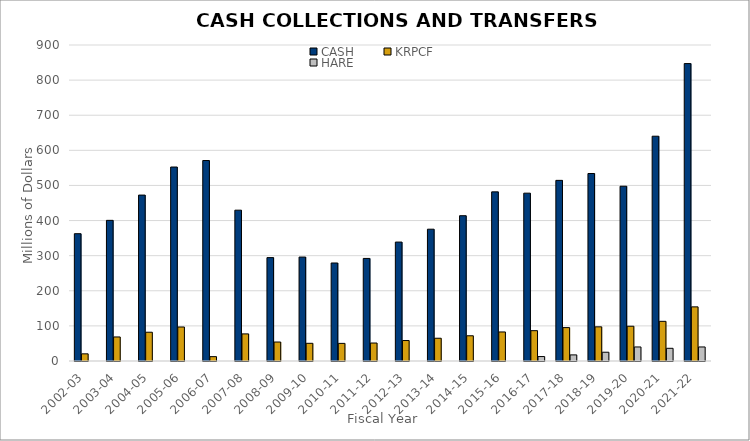
| Category | CASH | KRPCF | HARE |
|---|---|---|---|
| 2002-03 | 362.561 | 20.4 | 0 |
| 2003-04 | 400.59 | 68.456 | 0 |
| 2004-05 | 472.539 | 81.928 | 0 |
| 2005-06 | 552.45 | 96.879 | 0 |
| 2006-07 | 570.994 | 12.414 | 0 |
| 2007-08 | 429.54 | 77.2 | 0 |
| 2008-09 | 294.464 | 54.029 | 0 |
| 2009-10 | 296.033 | 50.392 | 0 |
| 2010-11 | 279.151 | 50.167 | 0 |
| 2011-12 | 292.152 | 51.203 | 0 |
| 2012-13 | 338.745 | 58.317 | 0 |
| 2013-14 | 375.408 | 64.806 | 0 |
| 2014-15 | 413.779 | 71.841 | 0 |
| 2015-16 | 481.72 | 82.717 | 0 |
| 2016-17 | 478.005 | 86.406 | 12.668 |
| 2017-18 | 514.441 | 95.101 | 17.395 |
| 2018-19 | 533.981 | 97.289 | 25 |
| 2019-20 | 497.792 | 99.032 | 40 |
| 2020-21 | 640.233 | 112.972 | 36.162 |
| 2021-22 | 847.072 | 154.189 | 40 |